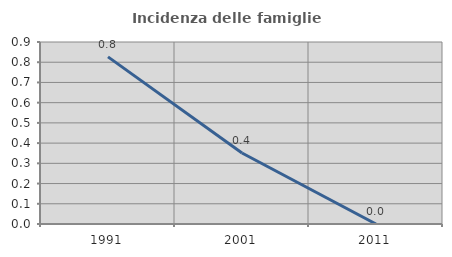
| Category | Incidenza delle famiglie numerose |
|---|---|
| 1991.0 | 0.826 |
| 2001.0 | 0.351 |
| 2011.0 | 0 |